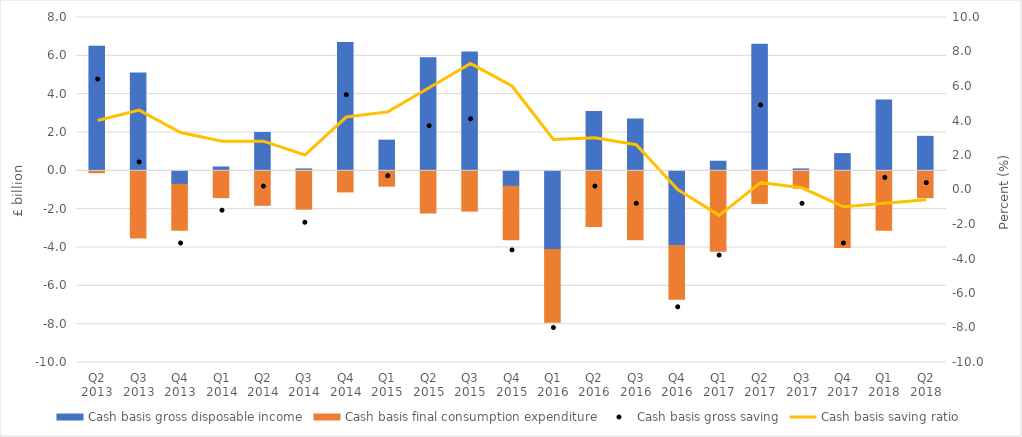
| Category | Cash basis gross disposable income | Cash basis final consumption expenditure |
|---|---|---|
| Q2 2013 | 6.5 | -0.1 |
| Q3 2013 | 5.1 | -3.5 |
| Q4 2013 | -0.7 | -2.4 |
| Q1 2014 | 0.2 | -1.4 |
| Q2 2014 | 2 | -1.8 |
| Q3 2014 | 0.1 | -2 |
| Q4 2014 | 6.7 | -1.1 |
| Q1 2015 | 1.6 | -0.8 |
| Q2 2015 | 5.9 | -2.2 |
| Q3 2015 | 6.2 | -2.1 |
| Q4 2015 | -0.8 | -2.8 |
| Q1 2016 | -4.1 | -3.8 |
| Q2 2016 | 3.1 | -2.9 |
| Q3 2016 | 2.7 | -3.6 |
| Q4 2016 | -3.9 | -2.8 |
| Q1 2017 | 0.5 | -4.2 |
| Q2 2017 | 6.6 | -1.7 |
| Q3 2017 | 0.1 | -0.9 |
| Q4 2017 | 0.9 | -4 |
| Q1 2018 | 3.7 | -3.1 |
| Q2 2018 | 1.8 | -1.4 |